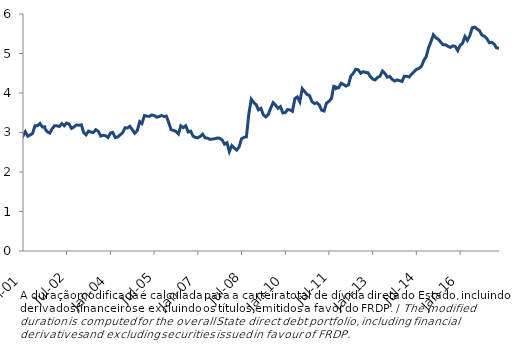
| Category | Series 0 |
|---|---|
| 2001-01-31 | 2.946 |
| 2001-02-01 | 2.916 |
| 2001-03-01 | 3.02 |
| 2001-04-01 | 2.907 |
| 2001-05-30 | 2.973 |
| 2001-06-30 | 3.172 |
| 2001-07-31 | 3.172 |
| 2001-08-31 | 3.228 |
| 2001-09-30 | 3.14 |
| 2001-10-30 | 3.143 |
| 2001-11-01 | 3.096 |
| 2001-12-01 | 3.015 |
| 2002-01-01 | 2.985 |
| 2002-02-01 | 3.098 |
| 2002-03-01 | 3.171 |
| 2002-04-01 | 3.169 |
| 2002-05-01 | 3.152 |
| 2002-06-01 | 3.227 |
| 2002-07-01 | 3.172 |
| 2002-08-01 | 3.24 |
| 2002-09-01 | 3.207 |
| 2002-10-01 | 3.104 |
| 2002-11-01 | 3.141 |
| 2002-12-01 | 3.19 |
| 2003-01-01 | 3.184 |
| 2003-02-01 | 3.196 |
| 2003-03-01 | 3.006 |
| 2003-04-01 | 2.942 |
| 2003-05-01 | 3.035 |
| 2003-06-01 | 3.009 |
| 2003-07-01 | 3 |
| 2003-08-01 | 3.071 |
| 2003-09-01 | 3.03 |
| 2003-10-01 | 2.91 |
| 2003-11-01 | 2.931 |
| 2003-12-01 | 2.918 |
| 2004-01-01 | 2.873 |
| 2004-02-01 | 2.986 |
| 2004-03-01 | 3.003 |
| 2004-04-01 | 2.873 |
| 2004-05-01 | 2.887 |
| 2004-06-01 | 2.94 |
| 2004-07-01 | 2.993 |
| 2004-08-01 | 3.119 |
| 2004-09-01 | 3.114 |
| 2004-10-01 | 3.157 |
| 2004-11-01 | 3.067 |
| 2004-12-01 | 2.981 |
| 2005-01-01 | 3.047 |
| 2005-02-01 | 3.274 |
| 2005-03-01 | 3.226 |
| 2005-04-01 | 3.428 |
| 2005-05-01 | 3.415 |
| 2005-06-01 | 3.407 |
| 2005-07-01 | 3.444 |
| 2005-08-01 | 3.43 |
| 2005-09-01 | 3.389 |
| 2005-10-01 | 3.403 |
| 2005-11-01 | 3.433 |
| 2005-12-01 | 3.405 |
| 2006-01-01 | 3.415 |
| 2006-02-01 | 3.245 |
| 2006-03-01 | 3.071 |
| 2006-04-01 | 3.054 |
| 2006-05-01 | 3.025 |
| 2006-06-01 | 2.962 |
| 2006-07-01 | 3.169 |
| 2006-08-01 | 3.122 |
| 2006-09-01 | 3.17 |
| 2006-10-01 | 3.013 |
| 2006-11-01 | 3.034 |
| 2006-12-01 | 2.911 |
| 2007-01-01 | 2.872 |
| 2007-02-01 | 2.869 |
| 2007-03-01 | 2.9 |
| 2007-04-01 | 2.958 |
| 2007-05-01 | 2.867 |
| 2007-06-01 | 2.858 |
| 2007-07-01 | 2.826 |
| 2007-08-31 | 2.842 |
| 2007-09-30 | 2.862 |
| 2007-10-31 | 2.852 |
| 2007-11-30 | 2.814 |
| 2007-12-31 | 2.705 |
| 2008-01-31 | 2.742 |
| 2008-02-29 | 2.517 |
| 2008-03-31 | 2.668 |
| 2008-04-30 | 2.609 |
| 2008-05-31 | 2.555 |
| 2008-06-30 | 2.632 |
| 2008-07-31 | 2.84 |
| 2008-08-31 | 2.878 |
| 2008-09-30 | 2.889 |
| 2008-10-31 | 3.476 |
| 2008-11-30 | 3.843 |
| 2008-12-31 | 3.759 |
| 2009-01-31 | 3.702 |
| 2009-02-28 | 3.574 |
| 2009-03-31 | 3.612 |
| 2009-04-30 | 3.448 |
| 2009-05-31 | 3.396 |
| 2009-06-30 | 3.451 |
| 2009-07-31 | 3.614 |
| 2009-08-31 | 3.755 |
| 2009-09-30 | 3.694 |
| 2009-10-31 | 3.612 |
| 2009-11-30 | 3.656 |
| 2009-12-31 | 3.494 |
| 2010-01-31 | 3.505 |
| 2010-02-28 | 3.581 |
| 2010-03-31 | 3.57 |
| 2010-04-30 | 3.537 |
| 2010-05-31 | 3.86 |
| 2010-06-30 | 3.9 |
| 2010-07-31 | 3.778 |
| 2010-08-31 | 4.109 |
| 2010-09-30 | 4.038 |
| 2010-10-31 | 3.962 |
| 2010-11-30 | 3.935 |
| 2010-12-31 | 3.781 |
| 2011-01-31 | 3.733 |
| 2011-02-28 | 3.753 |
| 2011-03-31 | 3.702 |
| 2011-04-30 | 3.566 |
| 2011-05-31 | 3.543 |
| 2011-06-30 | 3.742 |
| 2011-07-31 | 3.789 |
| 2011-08-31 | 3.857 |
| 2011-09-30 | 4.17 |
| 2011-10-31 | 4.147 |
| 2011-11-01 | 4.114 |
| 2011-12-01 | 4.135 |
| 2012-01-01 | 4.247 |
| 2012-02-01 | 4.214 |
| 2012-03-01 | 4.174 |
| 2012-04-01 | 4.205 |
| 2012-05-01 | 4.43 |
| 2012-06-01 | 4.5 |
| 2012-07-01 | 4.601 |
| 2012-08-01 | 4.587 |
| 2012-09-01 | 4.5 |
| 2012-10-01 | 4.539 |
| 2012-11-01 | 4.522 |
| 2012-12-01 | 4.513 |
| 2013-01-01 | 4.415 |
| 2013-02-01 | 4.35 |
| 2013-03-01 | 4.331 |
| 2013-04-01 | 4.395 |
| 2013-05-01 | 4.426 |
| 2013-06-01 | 4.556 |
| 2013-07-01 | 4.499 |
| 2013-08-01 | 4.4 |
| 2013-09-01 | 4.419 |
| 2013-10-01 | 4.346 |
| 2013-11-01 | 4.303 |
| 2013-12-01 | 4.331 |
| 2014-01-01 | 4.312 |
| 2014-02-01 | 4.292 |
| 2014-03-01 | 4.422 |
| 2014-04-01 | 4.422 |
| 2014-05-01 | 4.404 |
| 2014-06-01 | 4.48 |
| 2014-07-01 | 4.536 |
| 2014-08-01 | 4.6 |
| 2014-09-01 | 4.621 |
| 2014-10-01 | 4.672 |
| 2014-11-01 | 4.822 |
| 2014-12-01 | 4.92 |
| 2015-01-01 | 5.154 |
| 2015-02-01 | 5.311 |
| 2015-03-01 | 5.474 |
| 2015-04-01 | 5.399 |
| 2015-05-01 | 5.362 |
| 2015-06-30 | 5.221 |
| 2015-07-31 | 5.221 |
| 2015-08-31 | 5.182 |
| 2015-09-30 | 5.153 |
| 2015-10-31 | 5.194 |
| 2015-11-30 | 5.181 |
| 2015-12-31 | 5.074 |
| 2016-01-31 | 5.208 |
| 2016-02-29 | 5.256 |
| 2016-03-31 | 5.429 |
| 2016-04-30 | 5.332 |
| 2016-05-31 | 5.453 |
| 2016-06-30 | 5.651 |
| 2016-07-31 | 5.668 |
| 2016-08-31 | 5.62 |
| 2016-09-30 | 5.574 |
| 2016-10-31 | 5.461 |
| 2016-11-30 | 5.438 |
| 2016-12-31 | 5.373 |
| 2017-01-31 | 5.271 |
| 2017-02-28 | 5.285 |
| 2017-03-31 | 5.24 |
| 2017-04-30 | 5.143 |
| 2017-05-31 | 5.131 |